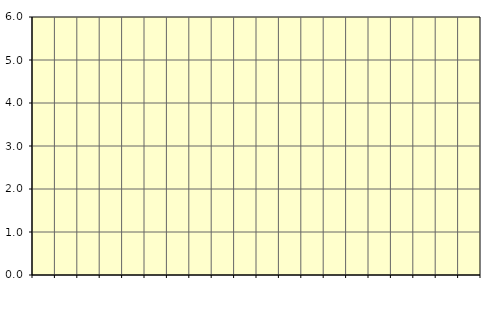
| Category | Piggar | Transport, SNI 49-53 |
|---|---|---|
| nan | 8.1 | 8.05 |
| 1.0 | 7.9 | 7.96 |
| 1.0 | 7.9 | 7.86 |
| 1.0 | 7.7 | 7.79 |
| nan | 7.8 | 7.79 |
| 2.0 | 7.9 | 7.83 |
| 2.0 | 7.8 | 7.87 |
| 2.0 | 8 | 7.87 |
| nan | 7.8 | 7.8 |
| 3.0 | 7.8 | 7.69 |
| 3.0 | 7.5 | 7.59 |
| 3.0 | 7.6 | 7.49 |
| nan | 7.4 | 7.41 |
| 4.0 | 7.3 | 7.33 |
| 4.0 | 7.4 | 7.24 |
| 4.0 | 7 | 7.19 |
| nan | 7.2 | 7.23 |
| 5.0 | 7.3 | 7.33 |
| 5.0 | 7.5 | 7.4 |
| 5.0 | 7.4 | 7.43 |
| nan | 7.5 | 7.43 |
| 6.0 | 7.4 | 7.46 |
| 6.0 | 7.4 | 7.52 |
| 6.0 | 7.6 | 7.58 |
| nan | 7.5 | 7.62 |
| 7.0 | 7.7 | 7.65 |
| 7.0 | 7.7 | 7.72 |
| 7.0 | 7.8 | 7.74 |
| nan | 7.7 | 7.68 |
| 8.0 | 7.5 | 7.54 |
| 8.0 | 7.5 | 7.4 |
| 8.0 | 7.2 | 7.3 |
| nan | 7.2 | 7.25 |
| 9.0 | 7.2 | 7.25 |
| 9.0 | 7.4 | 7.3 |
| 9.0 | 7.4 | 7.42 |
| nan | 7.7 | 7.58 |
| 10.0 | 7.8 | 7.71 |
| 10.0 | 7.7 | 7.79 |
| 10.0 | 7.9 | 7.8 |
| nan | 7.8 | 7.74 |
| 11.0 | 7.6 | 7.63 |
| 11.0 | 7.5 | 7.53 |
| 11.0 | 7.5 | 7.49 |
| nan | 7.4 | 7.47 |
| 12.0 | 7.5 | 7.45 |
| 12.0 | 7.4 | 7.47 |
| 12.0 | 7.5 | 7.54 |
| nan | 7.6 | 7.66 |
| 13.0 | 7.8 | 7.75 |
| 13.0 | 7.7 | 7.75 |
| 13.0 | 7.7 | 7.71 |
| nan | 7.7 | 7.71 |
| 14.0 | 7.6 | 7.77 |
| 14.0 | 8 | 7.81 |
| 14.0 | 7.6 | 7.76 |
| nan | 7.7 | 7.68 |
| 15.0 | 7.6 | 7.64 |
| 15.0 | 7.7 | 7.63 |
| 15.0 | 7.6 | 7.61 |
| nan | 7.6 | 7.58 |
| 16.0 | 7.6 | 7.58 |
| 16.0 | 7.6 | 7.63 |
| 16.0 | 7.8 | 7.7 |
| nan | 7.7 | 7.78 |
| 17.0 | 7.8 | 7.82 |
| 17.0 | 7.8 | 7.85 |
| 17.0 | 7.8 | 7.87 |
| nan | 7.9 | 7.85 |
| 18.0 | 8 | 7.75 |
| 18.0 | 7.5 | 7.67 |
| 18.0 | 7.9 | 7.65 |
| nan | 7.7 | 7.76 |
| 19.0 | 7.7 | 7.91 |
| 19.0 | 8.2 | 7.97 |
| 19.0 | 7.6 | 7.96 |
| nan | 7.6 | 7.47 |
| 20.0 | 6.6 | 6.72 |
| 20.0 | 6.8 | 6.86 |
| 20.0 | 7.2 | 7 |